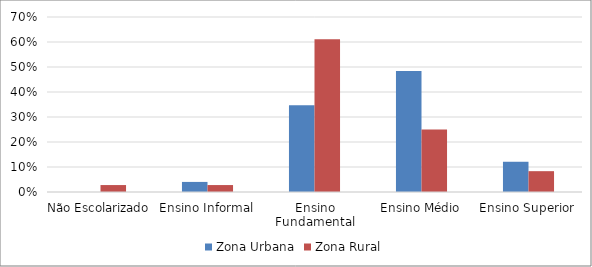
| Category | Zona Urbana | Zona Rural |
|---|---|---|
| Não Escolarizado | 0 | 0.028 |
| Ensino Informal | 0.04 | 0.028 |
| Ensino Fundamental | 0.347 | 0.611 |
| Ensino Médio | 0.484 | 0.25 |
| Ensino Superior | 0.121 | 0.083 |